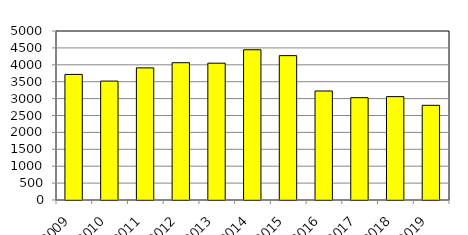
| Category | Veräußer-ungsfälle |
|---|---|
| 2009 | 3716 |
| 2010 | 3518 |
| 2011 | 3909 |
| 2012 | 4062 |
| 2013 | 4048 |
| 2014 | 4445 |
| 2015 | 4271 |
| 2016 | 3225 |
| 2017 | 3027 |
| 2018 | 3058 |
| 2019 | 2801 |